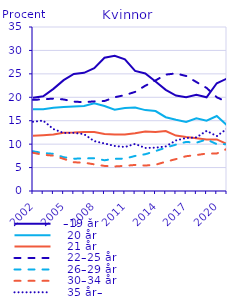
| Category |   –19 år |    20 år |    21 år |    22–25 år |    26–29 år |    30–34 år |    35 år– |
|---|---|---|---|---|---|---|---|
| 2002.0 | 19.897 | 17.459 | 11.791 | 19.449 | 8.477 | 8.155 | 14.774 |
| 2003.0 | 20.207 | 17.452 | 11.913 | 19.559 | 8.102 | 7.74 | 15.025 |
| 2004.0 | 21.794 | 17.776 | 12.036 | 19.721 | 7.932 | 7.535 | 13.206 |
| 2005.0 | 23.656 | 17.903 | 12.449 | 19.54 | 7.205 | 6.863 | 12.384 |
| 2006.0 | 24.98 | 18.036 | 12.474 | 19.072 | 6.892 | 6.132 | 12.414 |
| 2007.0 | 25.217 | 18.131 | 12.58 | 18.957 | 6.952 | 6.04 | 12.123 |
| 2008.0 | 26.231 | 18.728 | 12.592 | 19.125 | 6.989 | 5.692 | 10.643 |
| 2009.0 | 28.43 | 18.132 | 12.185 | 19.197 | 6.559 | 5.354 | 10.143 |
| 2010.0 | 28.848 | 17.368 | 12.041 | 20.013 | 6.883 | 5.236 | 9.611 |
| 2011.0 | 28.101 | 17.732 | 12.051 | 20.458 | 6.9 | 5.367 | 9.391 |
| 2012.0 | 25.636 | 17.794 | 12.326 | 21.151 | 7.484 | 5.563 | 10.045 |
| 2013.0 | 25.094 | 17.261 | 12.706 | 22.471 | 7.847 | 5.433 | 9.187 |
| 2014.0 | 23.367 | 17.052 | 12.618 | 23.598 | 8.513 | 5.608 | 9.243 |
| 2015.0 | 21.587 | 15.748 | 12.803 | 24.842 | 9.255 | 6.244 | 9.521 |
| 2016.0 | 20.379 | 15.215 | 11.82 | 25.092 | 9.895 | 6.807 | 10.792 |
| 2017.0 | 19.998 | 14.743 | 11.503 | 24.544 | 10.477 | 7.423 | 11.311 |
| 2018.0 | 20.533 | 15.514 | 11.279 | 23.258 | 10.305 | 7.665 | 11.446 |
| 2019.0 | 20 | 15 | 11 | 22 | 11 | 8 | 12.82 |
| 2020.0 | 23 | 16 | 11 | 20 | 10 | 8 | 11.717 |
| 2021.0 | 24 | 14 | 10 | 19 | 10 | 9 | 13.293 |